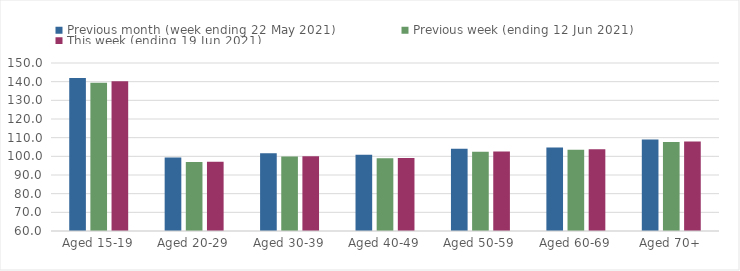
| Category | Previous month (week ending 22 May 2021) | Previous week (ending 12 Jun 2021) | This week (ending 19 Jun 2021) |
|---|---|---|---|
| Aged 15-19 | 142.01 | 139.44 | 140.29 |
| Aged 20-29 | 99.31 | 96.9 | 97.1 |
| Aged 30-39 | 101.68 | 99.87 | 100.04 |
| Aged 40-49 | 100.86 | 98.95 | 99.14 |
| Aged 50-59 | 104.07 | 102.44 | 102.59 |
| Aged 60-69 | 104.79 | 103.57 | 103.83 |
| Aged 70+ | 108.96 | 107.68 | 107.91 |